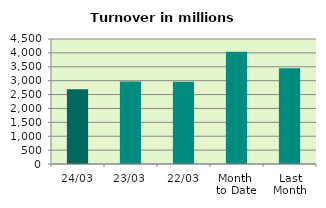
| Category | Series 0 |
|---|---|
| 24/03 | 2693.626 |
| 23/03 | 2973.051 |
| 22/03 | 2962.478 |
| Month 
to Date | 4040.969 |
| Last
Month | 3445.759 |